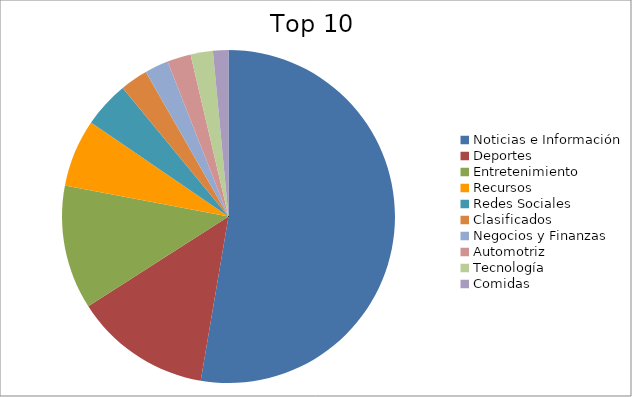
| Category | Series 0 |
|---|---|
| Noticias e Información | 49.31 |
| Deportes | 12.42 |
| Entretenimiento | 11.28 |
| Recursos | 6.14 |
| Redes Sociales | 4.21 |
| Clasificados | 2.52 |
| Negocios y Finanzas | 2.16 |
| Automotriz | 2.15 |
| Tecnología | 2.03 |
| Comidas | 1.4 |